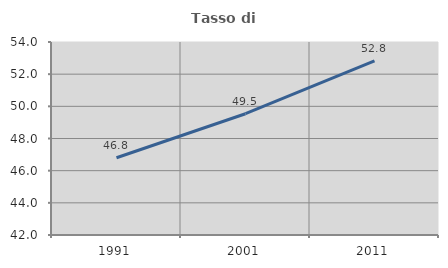
| Category | Tasso di occupazione   |
|---|---|
| 1991.0 | 46.803 |
| 2001.0 | 49.541 |
| 2011.0 | 52.822 |